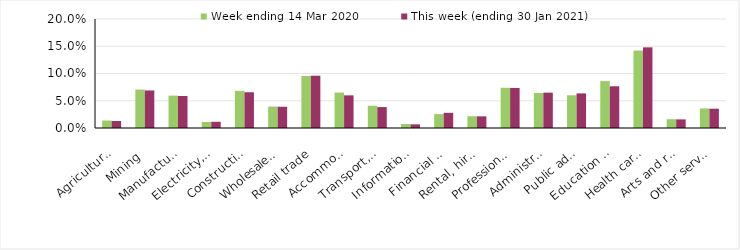
| Category | Week ending 14 Mar 2020 | This week (ending 30 Jan 2021) |
|---|---|---|
| Agriculture, forestry and fishing | 0.014 | 0.013 |
| Mining | 0.07 | 0.069 |
| Manufacturing | 0.059 | 0.059 |
| Electricity, gas, water and waste services | 0.011 | 0.011 |
| Construction | 0.068 | 0.066 |
| Wholesale trade | 0.039 | 0.039 |
| Retail trade | 0.096 | 0.096 |
| Accommodation and food services | 0.065 | 0.06 |
| Transport, postal and warehousing | 0.041 | 0.038 |
| Information media and telecommunications | 0.007 | 0.007 |
| Financial and insurance services | 0.025 | 0.028 |
| Rental, hiring and real estate services | 0.022 | 0.021 |
| Professional, scientific and technical services | 0.074 | 0.074 |
| Administrative and support services | 0.064 | 0.065 |
| Public administration and safety | 0.06 | 0.064 |
| Education and training | 0.086 | 0.077 |
| Health care and social assistance | 0.142 | 0.148 |
| Arts and recreation services | 0.016 | 0.016 |
| Other services | 0.036 | 0.035 |